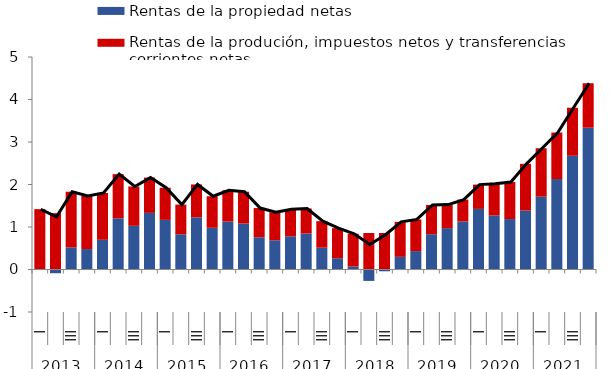
| Category | Rentas de la propiedad netas | Rentas de la produción, impuestos netos y transferencias corrientes netas |
|---|---|---|
| 0 | -0.007 | 1.421 |
| 1 | -0.088 | 1.326 |
| 2 | 0.519 | 1.311 |
| 3 | 0.481 | 1.25 |
| 4 | 0.699 | 1.103 |
| 5 | 1.205 | 1.039 |
| 6 | 1.028 | 0.927 |
| 7 | 1.332 | 0.83 |
| 8 | 1.167 | 0.758 |
| 9 | 0.828 | 0.7 |
| 10 | 1.227 | 0.774 |
| 11 | 0.981 | 0.743 |
| 12 | 1.128 | 0.737 |
| 13 | 1.082 | 0.748 |
| 14 | 0.757 | 0.689 |
| 15 | 0.688 | 0.658 |
| 16 | 0.781 | 0.639 |
| 17 | 0.847 | 0.589 |
| 18 | 0.513 | 0.625 |
| 19 | 0.264 | 0.709 |
| 20 | 0.071 | 0.77 |
| 21 | -0.269 | 0.858 |
| 22 | -0.042 | 0.859 |
| 23 | 0.298 | 0.824 |
| 24 | 0.433 | 0.745 |
| 25 | 0.83 | 0.689 |
| 26 | 0.974 | 0.553 |
| 27 | 1.13 | 0.515 |
| 28 | 1.426 | 0.572 |
| 29 | 1.271 | 0.744 |
| 30 | 1.187 | 0.872 |
| 31 | 1.386 | 1.099 |
| 32 | 1.714 | 1.14 |
| 33 | 2.128 | 1.095 |
| 34 | 2.676 | 1.129 |
| 35 | 3.336 | 1.046 |